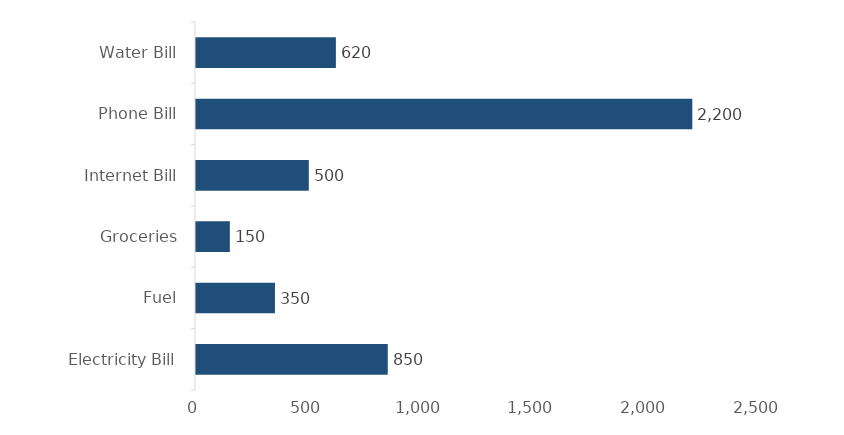
| Category | Total |
|---|---|
| Electricity Bill | 850 |
| Fuel | 350 |
| Groceries | 150 |
| Internet Bill | 500 |
| Phone Bill | 2200 |
| Water Bill | 620 |